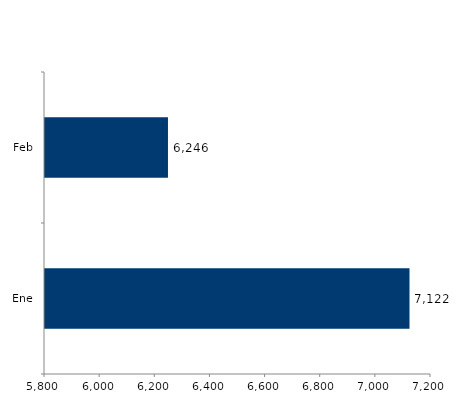
| Category | Series 0 |
|---|---|
| Ene | 7122 |
| Feb | 6246 |